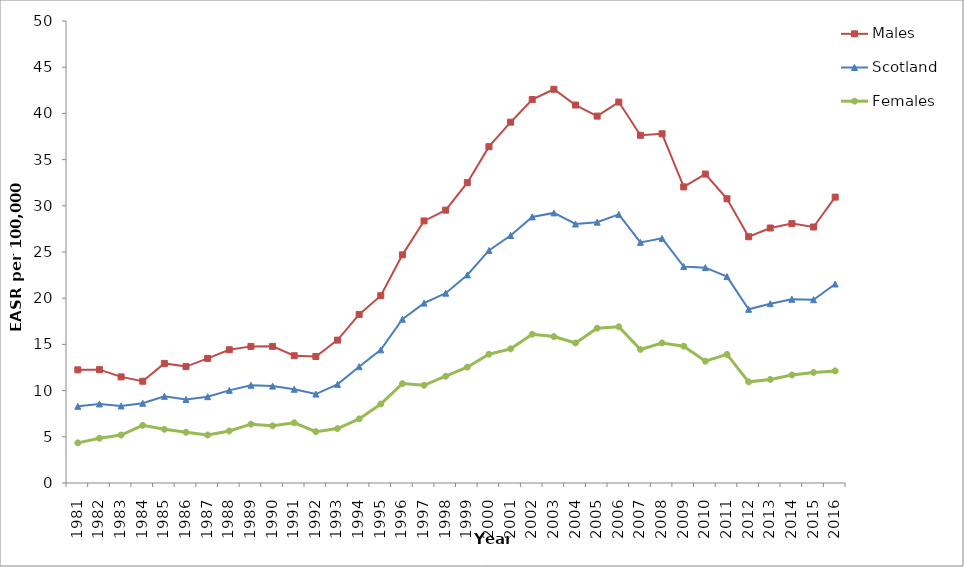
| Category | Males | Scotland | Females |
|---|---|---|---|
| 1981.0 | 12.244 | 8.294 | 4.344 |
| 1982.0 | 12.266 | 8.556 | 4.846 |
| 1983.0 | 11.485 | 8.338 | 5.191 |
| 1984.0 | 11.014 | 8.627 | 6.241 |
| 1985.0 | 12.943 | 9.378 | 5.814 |
| 1986.0 | 12.599 | 9.045 | 5.49 |
| 1987.0 | 13.485 | 9.34 | 5.194 |
| 1988.0 | 14.419 | 10.028 | 5.636 |
| 1989.0 | 14.786 | 10.577 | 6.368 |
| 1990.0 | 14.787 | 10.487 | 6.188 |
| 1991.0 | 13.774 | 10.144 | 6.514 |
| 1992.0 | 13.695 | 9.625 | 5.555 |
| 1993.0 | 15.462 | 10.678 | 5.893 |
| 1994.0 | 18.244 | 12.591 | 6.938 |
| 1995.0 | 20.268 | 14.408 | 8.549 |
| 1996.0 | 24.692 | 17.724 | 10.757 |
| 1997.0 | 28.363 | 19.47 | 10.578 |
| 1998.0 | 29.53 | 20.544 | 11.557 |
| 1999.0 | 32.503 | 22.52 | 12.536 |
| 2000.0 | 36.4 | 25.168 | 13.937 |
| 2001.0 | 39.049 | 26.784 | 14.519 |
| 2002.0 | 41.498 | 28.798 | 16.098 |
| 2003.0 | 42.611 | 29.231 | 15.85 |
| 2004.0 | 40.906 | 28.029 | 15.153 |
| 2005.0 | 39.706 | 28.228 | 16.75 |
| 2006.0 | 41.227 | 29.07 | 16.913 |
| 2007.0 | 37.634 | 26.043 | 14.452 |
| 2008.0 | 37.796 | 26.476 | 15.156 |
| 2009.0 | 32.047 | 23.429 | 14.811 |
| 2010.0 | 33.434 | 23.307 | 13.181 |
| 2011.0 | 30.761 | 22.34 | 13.919 |
| 2012.0 | 26.652 | 18.799 | 10.946 |
| 2013.0 | 27.599 | 19.404 | 11.208 |
| 2014.0 | 28.07 | 19.881 | 11.692 |
| 2015.0 | 27.705 | 19.836 | 11.967 |
| 2016.0 | 30.938 | 21.536 | 12.133 |